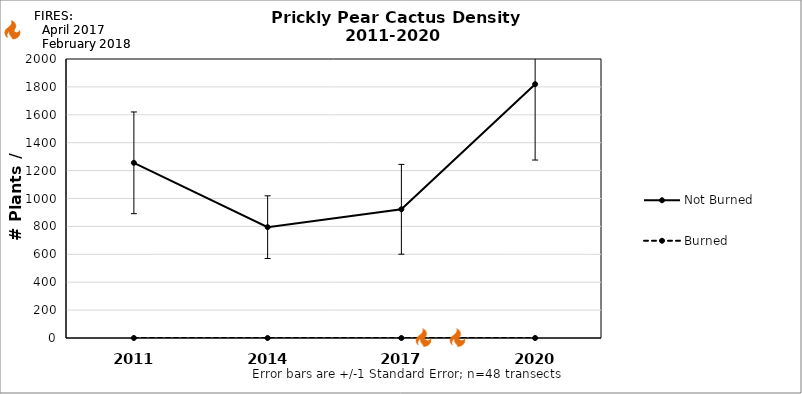
| Category | Not Burned | Burned |
|---|---|---|
| 2011.0 | 1255.788 | 0 |
| 2014.0 | 794.478 | 0 |
| 2017.0 | 922.62 | 0 |
| 2020.0 | 1819.612 | 0 |